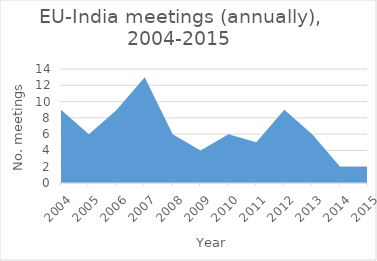
| Category | Number of meetings |
|---|---|
| 2004.0 | 9 |
| 2005.0 | 6 |
| 2006.0 | 9 |
| 2007.0 | 13 |
| 2008.0 | 6 |
| 2009.0 | 4 |
| 2010.0 | 6 |
| 2011.0 | 5 |
| 2012.0 | 9 |
| 2013.0 | 6 |
| 2014.0 | 2 |
| 2015.0 | 2 |